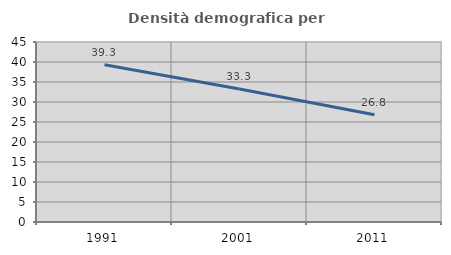
| Category | Densità demografica |
|---|---|
| 1991.0 | 39.332 |
| 2001.0 | 33.272 |
| 2011.0 | 26.788 |